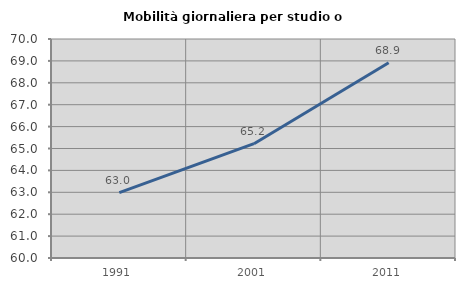
| Category | Mobilità giornaliera per studio o lavoro |
|---|---|
| 1991.0 | 62.983 |
| 2001.0 | 65.221 |
| 2011.0 | 68.912 |